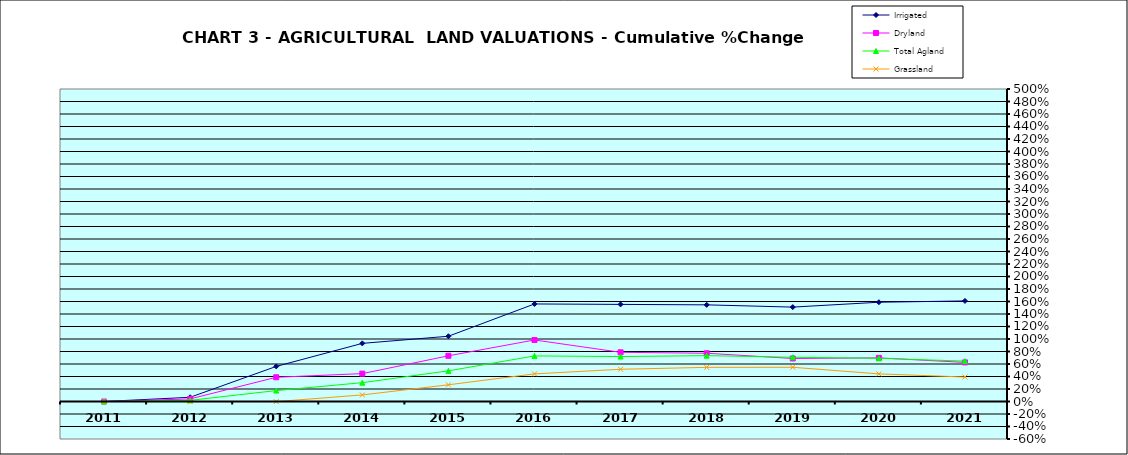
| Category | Irrigated | Dryland | Total Agland | Grassland |
|---|---|---|---|---|
| 2011.0 | 0 | 0 | 0 | 0 |
| 2012.0 | 0.067 | 0.041 | 0.019 | -0.002 |
| 2013.0 | 0.561 | 0.388 | 0.175 | -0.002 |
| 2014.0 | 0.93 | 0.446 | 0.301 | 0.105 |
| 2015.0 | 1.044 | 0.731 | 0.49 | 0.267 |
| 2016.0 | 1.561 | 0.984 | 0.729 | 0.442 |
| 2017.0 | 1.554 | 0.787 | 0.719 | 0.516 |
| 2018.0 | 1.546 | 0.772 | 0.734 | 0.546 |
| 2019.0 | 1.51 | 0.688 | 0.707 | 0.547 |
| 2020.0 | 1.588 | 0.698 | 0.691 | 0.442 |
| 2021.0 | 1.609 | 0.626 | 0.646 | 0.392 |